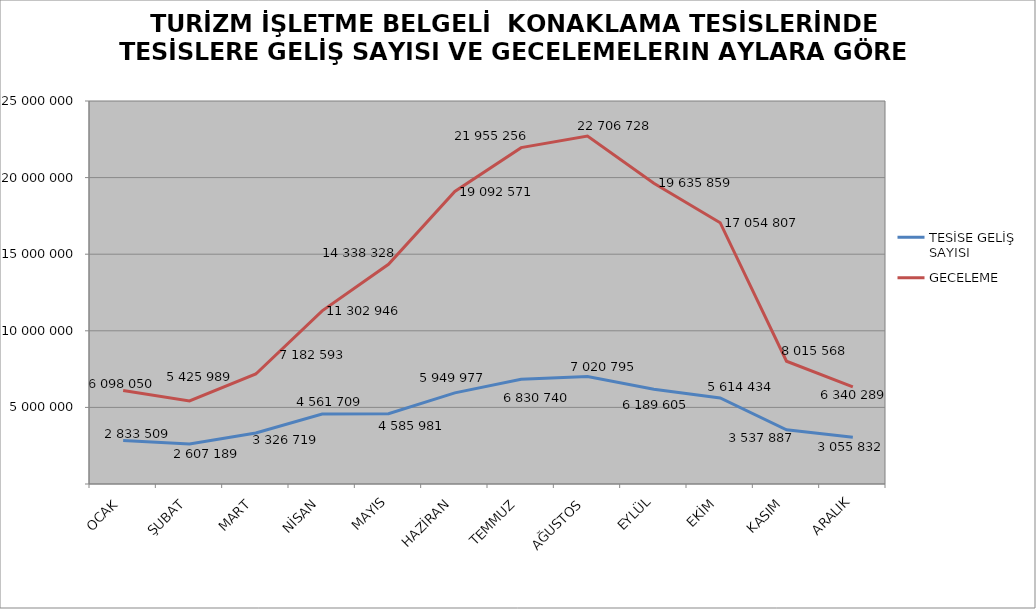
| Category | TESİSE GELİŞ SAYISI | GECELEME |
|---|---|---|
| OCAK | 2833509 | 6098050 |
| ŞUBAT | 2607189 | 5425989 |
| MART | 3326719 | 7182593 |
| NİSAN | 4561709 | 11302946 |
| MAYIS | 4585981 | 14338328 |
| HAZİRAN | 5949977 | 19092571 |
| TEMMUZ | 6830740 | 21955256 |
| AĞUSTOS | 7020795 | 22706728 |
| EYLÜL | 6189605 | 19635859 |
| EKİM | 5614434 | 17054807 |
| KASIM | 3537887 | 8015568 |
| ARALIK | 3055832 | 6340289 |